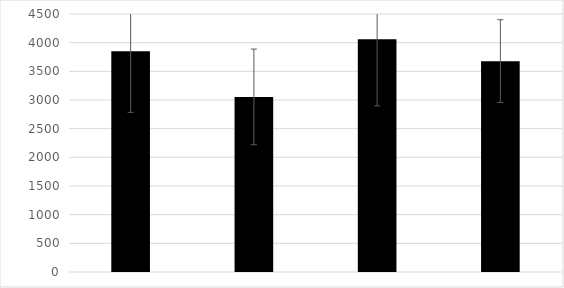
| Category | Series 0 |
|---|---|
| 0 | 3848.333 |
| 1 | 3054.333 |
| 2 | 4060.333 |
| 3 | 3678 |